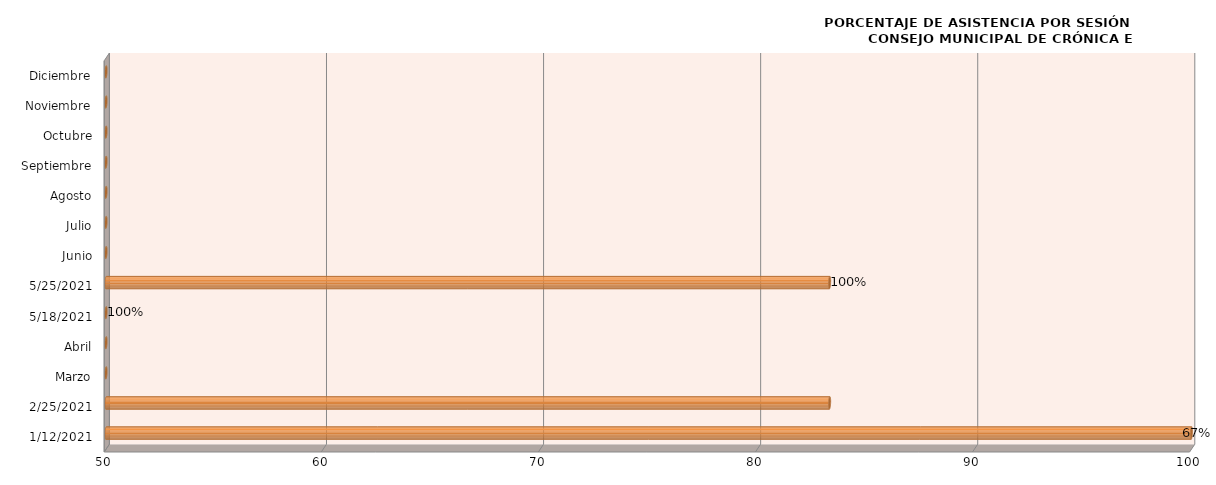
| Category | Series 0 |
|---|---|
| 12/01/2021 | 100 |
| 25/02/2021 | 83.333 |
| Marzo | 0 |
| Abril | 0 |
| 18/05/2021 | 0 |
| 25/05/2021 | 83.333 |
| Junio | 0 |
| Julio | 0 |
| Agosto | 0 |
| Septiembre | 0 |
| Octubre | 0 |
| Noviembre | 0 |
| Diciembre | 0 |